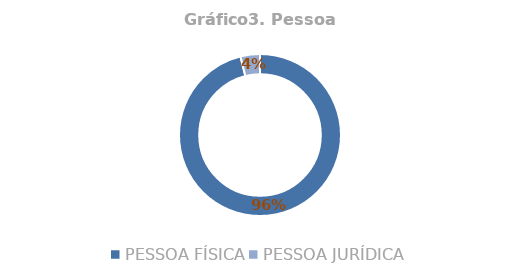
| Category | Total |
|---|---|
| PESSOA FÍSICA | 0.961 |
| PESSOA JURÍDICA | 0.039 |